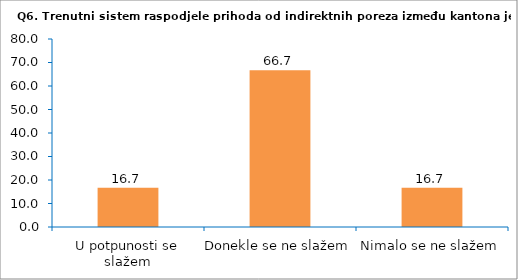
| Category | Series 0 |
|---|---|
| U potpunosti se slažem | 16.667 |
| Donekle se ne slažem | 66.667 |
| Nimalo se ne slažem | 16.667 |